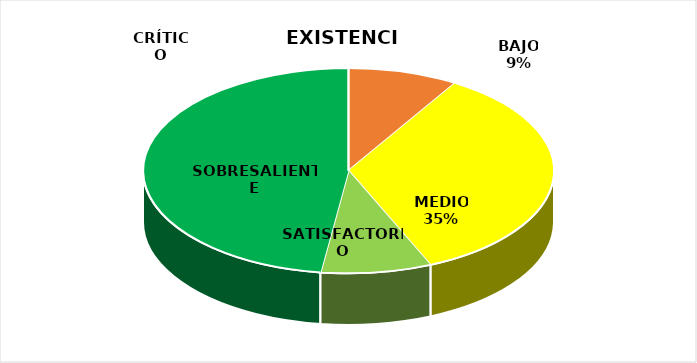
| Category | Series 1 | Series 0 |
|---|---|---|
| CRÍTICO | 0 | 2 |
| BAJO | 2 | 4 |
| MEDIO | 8 | 1 |
| SATISFACTORIO | 2 | 1 |
| SOBRESALIENTE | 11 | 49 |